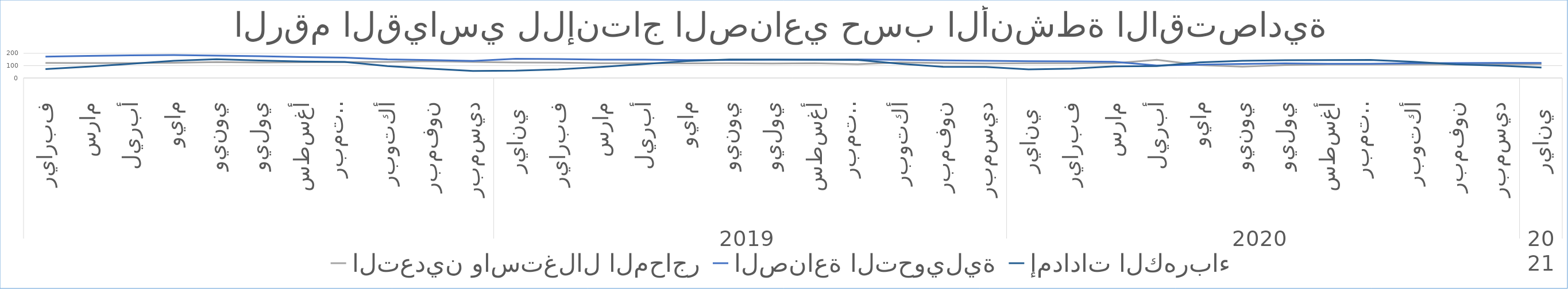
| Category | Series 0 | التعدين واستغلال المحاجر | الصناعة التحويلية | إمدادات الكهرباء |
|---|---|---|---|---|
| 0 |  | 121.68 | 173.65 | 71.77 |
| 1 |  | 121.34 | 179.1 | 91.95 |
| 2 |  | 120.86 | 183.92 | 115.21 |
| 3 |  | 122.84 | 185.71 | 139.9 |
| 4 |  | 128.58 | 180.98 | 152.24 |
| 5 |  | 126 | 176.46 | 142.08 |
| 6 |  | 127.52 | 170.01 | 133.96 |
| 7 |  | 128.62 | 165.64 | 129.9 |
| 8 |  | 130.34 | 150.89 | 96.41 |
| 9 |  | 135.86 | 144.85 | 75.75 |
| 10 |  | 130.35 | 138.79 | 57.38 |
| 11 |  | 125.45 | 155.98 | 59.15 |
| 12 |  | 124.14 | 153.87 | 70.1 |
| 13 |  | 119.87 | 148.98 | 89.82 |
| 14 |  | 120.11 | 148.54 | 113.29 |
| 15 |  | 118.43 | 145.76 | 137.57 |
| 16 |  | 119.81 | 146.05 | 149.7 |
| 17 |  | 117.33 | 148.68 | 148.56 |
| 18 |  | 119.89 | 149.23 | 147.74 |
| 19 |  | 111.81 | 150.42 | 146.92 |
| 20 |  | 126.19 | 147.61 | 115.24 |
| 21 |  | 121.13 | 142.69 | 90.54 |
| 22 |  | 117.67 | 139.99 | 88.97 |
| 23 |  | 119.34 | 136.15 | 70.29 |
| 24 |  | 119.94 | 134.33 | 75.21 |
| 25 |  | 119.36 | 131.91 | 93.65 |
| 26 |  | 147.17 | 100.84 | 96.77 |
| 27 |  | 104.241 | 107.99 | 126.45 |
| 28 |  | 91.98 | 114.521 | 139.52 |
| 29 |  | 104.21 | 118.159 | 144.04 |
| 30 |  | 110.42 | 115.41 | 145.89 |
| 31 |  | 110.395 | 114.682 | 146.405 |
| 32 |  | 110.3 | 119.88 | 130.822 |
| 33 |  | 110.28 | 120.487 | 110.681 |
| 34 |  | 110.378 | 121.664 | 99.825 |
| 35 |  | 111.9 | 121.691 | 85.058 |